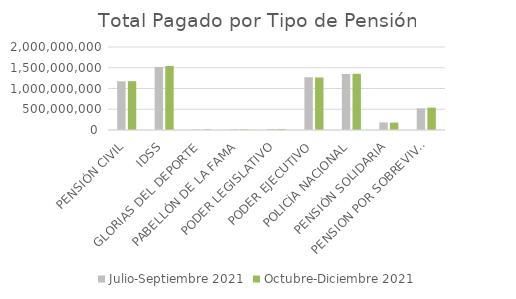
| Category | Julio-Septiembre 2021 | Octubre-Diciembre 2021 |
|---|---|---|
| PENSIÓN CIVIL | 1173442137.07 | 1176044296.63 |
| IDSS | 1519841427.98 | 1541474639.65 |
| GLORIAS DEL DEPORTE | 14051194.5 | 13814766 |
| PABELLÓN DE LA FAMA | 13794113.45 | 14317246.57 |
| PODER LEGISLATIVO | 24475306.24 | 23892285.82 |
| PODER EJECUTIVO | 1270376143.85 | 1266294876.38 |
| POLICÍA NACIONAL | 1349942285 | 1355419605.67 |
| PENSIÓN SOLIDARIA | 182934000 | 178296000 |
| PENSION POR SOBREVIVENCIA | 521272530.97 | 538130177.8 |